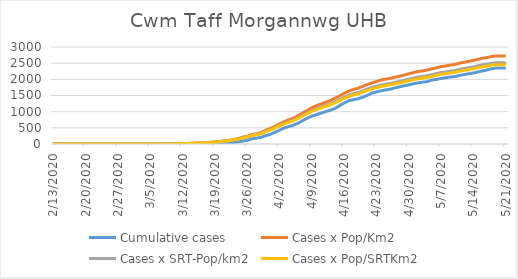
| Category | Cumulative cases | Cases x Pop/Km2 | Cases x SRT-Pop/km2 | Cases x Pop/SRTKm2 |
|---|---|---|---|---|
| 5/21/20 | 2352 | 2724.042 | 2514.653 | 2452.855 |
| 5/20/20 | 2352 | 2724.042 | 2514.653 | 2452.855 |
| 5/19/20 | 2352 | 2723.402 | 2514.063 | 2452.278 |
| 5/18/20 | 2329 | 2708.471 | 2500.279 | 2438.834 |
| 5/17/20 | 2292 | 2676.69 | 2470.941 | 2410.216 |
| 5/16/20 | 2261 | 2653.013 | 2449.084 | 2388.897 |
| 5/15/20 | 2229 | 2619.739 | 2418.368 | 2358.935 |
| 5/14/20 | 2196 | 2582.838 | 2384.303 | 2325.708 |
| 5/13/20 | 2173 | 2557.242 | 2360.675 | 2302.66 |
| 5/12/20 | 2148 | 2527.807 | 2333.502 | 2276.155 |
| 5/11/20 | 2120 | 2498.585 | 2306.526 | 2249.843 |
| 5/10/20 | 2086 | 2462.324 | 2273.053 | 2217.192 |
| 5/9/20 | 2071 | 2441.207 | 2253.559 | 2198.177 |
| 5/8/20 | 2050 | 2414.758 | 2229.143 | 2174.361 |
| 5/7/20 | 2028 | 2393.428 | 2209.453 | 2155.155 |
| 5/6/20 | 1997 | 2358.234 | 2176.964 | 2123.464 |
| 5/5/20 | 1978 | 2323.04 | 2144.475 | 2091.774 |
| 5/4/20 | 1929 | 2289.125 | 2113.167 | 2061.235 |
| 5/3/20 | 1911 | 2261.823 | 2087.964 | 2036.651 |
| 5/2/20 | 1891 | 2241.773 | 2069.455 | 2018.597 |
| 5/1/20 | 1863 | 2206.152 | 2036.572 | 1986.522 |
| 4/30/20 | 1829 | 2172.451 | 2005.461 | 1956.176 |
| 4/29/20 | 1801 | 2131.497 | 1967.656 | 1919.3 |
| 4/28/20 | 1771 | 2096.729 | 1935.56 | 1887.993 |
| 4/27/20 | 1735 | 2065.588 | 1906.812 | 1859.952 |
| 4/26/20 | 1697 | 2030.607 | 1874.52 | 1828.453 |
| 4/25/20 | 1673 | 2005.224 | 1851.089 | 1805.598 |
| 4/24/20 | 1646 | 1976.429 | 1824.507 | 1779.669 |
| 4/23/20 | 1608 | 1932.276 | 1783.748 | 1739.912 |
| 4/22/20 | 1575 | 1890.043 | 1744.761 | 1701.883 |
| 4/21/20 | 1503 | 1836.505 | 1695.338 | 1653.675 |
| 4/20/20 | 1446 | 1782.54 | 1645.522 | 1605.082 |
| 4/19/20 | 1397 | 1723.883 | 1591.373 | 1552.265 |
| 4/18/20 | 1369 | 1685.916 | 1556.324 | 1518.077 |
| 4/17/20 | 1338 | 1634.084 | 1508.477 | 1471.405 |
| 4/16/20 | 1266 | 1565.402 | 1445.074 | 1409.561 |
| 4/15/20 | 1182 | 1488.827 | 1374.386 | 1340.61 |
| 4/14/20 | 1099 | 1413.106 | 1304.485 | 1272.427 |
| 4/13/20 | 1044 | 1346.983 | 1243.445 | 1212.887 |
| 4/12/20 | 1002 | 1290.033 | 1190.872 | 1161.606 |
| 4/11/20 | 957 | 1238.201 | 1143.024 | 1114.934 |
| 4/10/20 | 907 | 1186.156 | 1094.98 | 1068.07 |
| 4/9/20 | 864 | 1122.166 | 1035.909 | 1010.451 |
| 4/8/20 | 797 | 1038.98 | 959.116 | 935.546 |
| 4/7/20 | 723 | 957.286 | 883.702 | 861.985 |
| 4/6/20 | 642 | 877.086 | 809.667 | 789.769 |
| 4/5/20 | 582 | 796.245 | 735.04 | 716.976 |
| 4/4/20 | 540 | 749.106 | 691.525 | 674.53 |
| 4/3/20 | 494 | 689.169 | 636.195 | 620.56 |
| 4/2/20 | 428 | 620.06 | 572.398 | 558.331 |
| 4/1/20 | 364 | 549.032 | 506.829 | 494.374 |
| 3/31/20 | 298 | 480.776 | 443.82 | 432.913 |
| 3/30/20 | 258 | 422.972 | 390.459 | 380.864 |
| 3/29/20 | 207 | 351.73 | 324.694 | 316.714 |
| 3/28/20 | 181 | 318.455 | 293.977 | 286.752 |
| 3/27/20 | 161 | 283.048 | 261.291 | 254.869 |
| 3/26/20 | 114 | 243.587 | 224.864 | 219.338 |
| 3/25/20 | 89 | 206.473 | 190.602 | 185.918 |
| 3/24/20 | 64 | 167.44 | 154.569 | 150.771 |
| 3/23/20 | 43 | 138.644 | 127.987 | 124.842 |
| 3/22/20 | 31 | 110.915 | 102.39 | 99.873 |
| 3/21/20 | 24 | 94.705 | 87.425 | 85.277 |
| 3/20/20 | 18 | 78.707 | 72.657 | 70.872 |
| 3/19/20 | 8 | 63.35 | 58.48 | 57.043 |
| 3/18/20 | 6 | 50.552 | 46.666 | 45.519 |
| 3/17/20 | 6 | 43.086 | 39.774 | 38.797 |
| 3/16/20 | 6 | 35.194 | 32.489 | 31.691 |
| 3/15/20 | 3 | 27.942 | 25.794 | 25.16 |
| 3/14/20 | 3 | 21.757 | 20.084 | 19.591 |
| 3/13/20 | 3 | 17.704 | 16.343 | 15.941 |
| 3/12/20 | 0 | 11.945 | 11.027 | 10.756 |
| 3/11/20 | 0 | 6.826 | 6.301 | 6.146 |
| 3/10/20 | 0 | 3.839 | 3.544 | 3.457 |
| 3/9/20 | 0 | 1.493 | 1.378 | 1.344 |
| 3/8/20 | 0 | 0.853 | 0.788 | 0.768 |
| 3/7/20 | 0 | 0.853 | 0.788 | 0.768 |
| 3/6/20 | 0 | 0.427 | 0.394 | 0.384 |
| 3/5/20 | 0 | 0.427 | 0.394 | 0.384 |
| 3/4/20 | 0 | 0.427 | 0.394 | 0.384 |
| 3/3/20 | 0 | 0.213 | 0.197 | 0.192 |
| 3/2/20 | 0 | 0.213 | 0.197 | 0.192 |
| 3/1/20 | 0 | 0.213 | 0.197 | 0.192 |
| 2/29/20 | 0 | 0.213 | 0.197 | 0.192 |
| 2/28/20 | 0 | 0.213 | 0.197 | 0.192 |
| 2/27/20 | 0 | 0.213 | 0.197 | 0.192 |
| 2/26/20 | 0 | 0 | 0 | 0 |
| 2/25/20 | 0 | 0 | 0 | 0 |
| 2/24/20 | 0 | 0 | 0 | 0 |
| 2/23/20 | 0 | 0 | 0 | 0 |
| 2/22/20 | 0 | 0 | 0 | 0 |
| 2/21/20 | 0 | 0 | 0 | 0 |
| 2/20/20 | 0 | 0 | 0 | 0 |
| 2/19/20 | 0 | 0 | 0 | 0 |
| 2/18/20 | 0 | 0 | 0 | 0 |
| 2/17/20 | 0 | 0 | 0 | 0 |
| 2/16/20 | 0 | 0 | 0 | 0 |
| 2/15/20 | 0 | 0 | 0 | 0 |
| 2/14/20 | 0 | 0 | 0 | 0 |
| 2/13/20 | 0 | 0 | 0 | 0 |